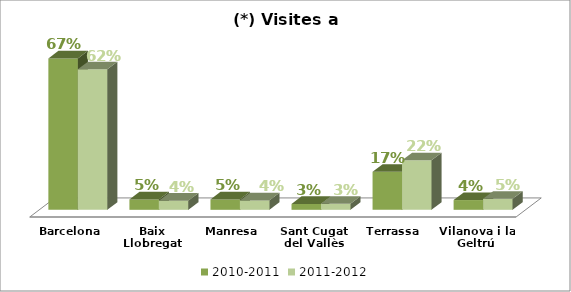
| Category | 2010-2011 | 2011-2012 |
|---|---|---|
| Barcelona | 0.671 | 0.623 |
| Baix Llobregat (Castelldefels) | 0.046 | 0.041 |
| Manresa | 0.046 | 0.042 |
| Sant Cugat del Vallès | 0.026 | 0.027 |
| Terrassa | 0.168 | 0.22 |
| Vilanova i la Geltrú | 0.043 | 0.049 |